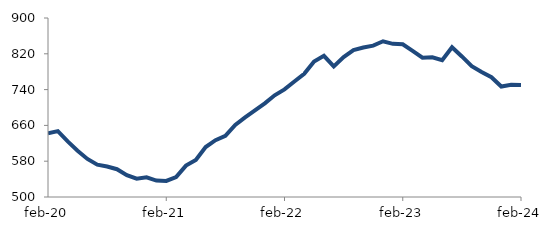
| Category | Series 0 |
|---|---|
| 2020-02-01 | 642.14 |
| 2020-03-01 | 647.24 |
| 2020-04-01 | 624.208 |
| 2020-05-01 | 603.464 |
| 2020-06-01 | 585.1 |
| 2020-07-01 | 572.204 |
| 2020-08-01 | 568.185 |
| 2020-09-01 | 562.085 |
| 2020-10-01 | 548.898 |
| 2020-11-01 | 541.013 |
| 2020-12-01 | 544.038 |
| 2021-01-01 | 536.772 |
| 2021-02-01 | 535.938 |
| 2021-03-01 | 544.717 |
| 2021-04-01 | 570.16 |
| 2021-05-01 | 582.981 |
| 2021-06-01 | 611.684 |
| 2021-07-01 | 627.037 |
| 2021-08-01 | 636.642 |
| 2021-09-01 | 661.114 |
| 2021-10-01 | 677.889 |
| 2021-11-01 | 693.389 |
| 2021-12-01 | 709.343 |
| 2022-01-01 | 727.31 |
| 2022-02-01 | 740.539 |
| 2022-03-01 | 758.027 |
| 2022-04-01 | 775.241 |
| 2022-05-01 | 802.956 |
| 2022-06-01 | 815.434 |
| 2022-07-01 | 791.89 |
| 2022-08-01 | 812.76 |
| 2022-09-01 | 828.12 |
| 2022-10-01 | 834 |
| 2022-11-01 | 838.178 |
| 2022-12-01 | 847.954 |
| 2023-01-01 | 842.285 |
| 2023-02-01 | 841.25 |
| 2023-03-01 | 826.38 |
| 2023-04-01 | 811.394 |
| 2023-05-01 | 812.228 |
| 2023-06-01 | 805.926 |
| 2023-07-01 | 834.815 |
| 2023-08-01 | 814.103 |
| 2023-09-01 | 792.442 |
| 2023-10-01 | 779.206 |
| 2023-11-01 | 767.605 |
| 2023-12-01 | 746.855 |
| 2024-01-01 | 750.731 |
| 2024-02-01 | 750.251 |